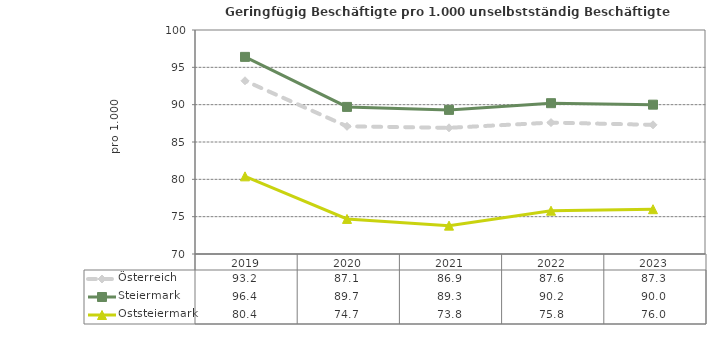
| Category | Österreich | Steiermark | Oststeiermark |
|---|---|---|---|
| 2023.0 | 87.3 | 90 | 76 |
| 2022.0 | 87.6 | 90.2 | 75.8 |
| 2021.0 | 86.9 | 89.3 | 73.8 |
| 2020.0 | 87.1 | 89.7 | 74.7 |
| 2019.0 | 93.2 | 96.4 | 80.4 |